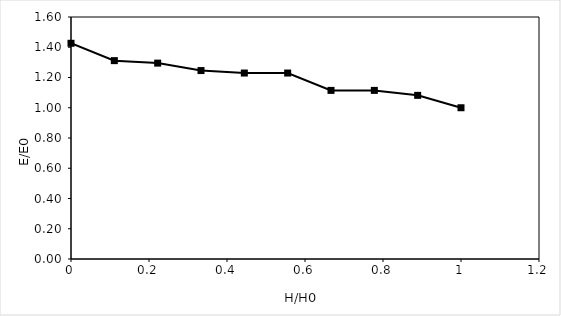
| Category | Head (feet) |
|---|---|
| 1.0 | 1 |
| 0.8888888888888888 | 1.082 |
| 0.7777777777777778 | 1.115 |
| 0.6666666666666666 | 1.115 |
| 0.5555555555555556 | 1.23 |
| 0.4444444444444444 | 1.23 |
| 0.3333333333333333 | 1.246 |
| 0.2222222222222222 | 1.295 |
| 0.1111111111111111 | 1.311 |
| 0.0 | 1.426 |